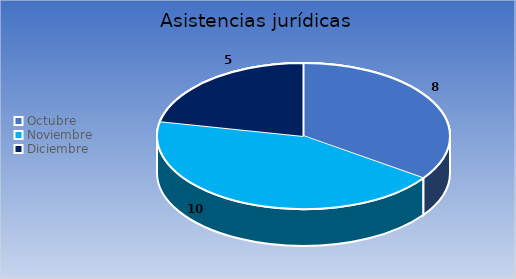
| Category | Cantidad |
|---|---|
| Octubre | 8 |
| Noviembre | 10 |
| Diciembre | 5 |